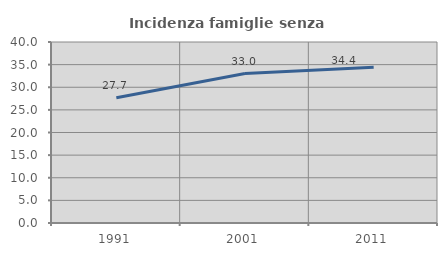
| Category | Incidenza famiglie senza nuclei |
|---|---|
| 1991.0 | 27.7 |
| 2001.0 | 33.028 |
| 2011.0 | 34.404 |